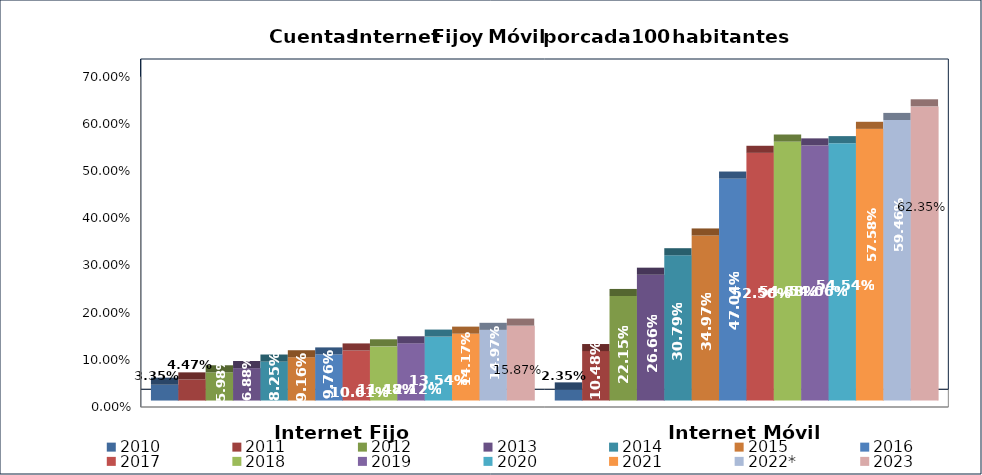
| Category | 2010 | 2011 | 2012 | 2013 | 2014 | 2015 | 2016 | 2017 | 2018 | 2019 | 2020 | 2021 | 2022* | 2023 |
|---|---|---|---|---|---|---|---|---|---|---|---|---|---|---|
| Internet Fijo | 0.033 | 0.045 | 0.06 | 0.069 | 0.083 | 0.092 | 0.098 | 0.106 | 0.115 | 0.121 | 0.135 | 0.142 | 0.15 | 0.159 |
| Internet Móvil | 0.024 | 0.105 | 0.222 | 0.267 | 0.308 | 0.35 | 0.47 | 0.525 | 0.549 | 0.541 | 0.545 | 0.576 | 0.595 | 0.623 |